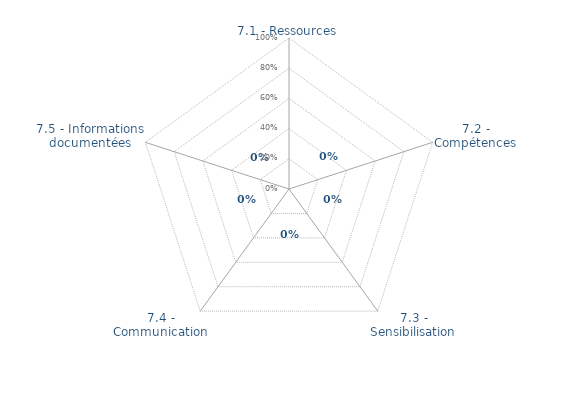
| Category | Art. 7 | limite de CONFORMITÉ |
|---|---|---|
| 7.1 - Ressources | 0 | 0 |
| 7.2 - Compétences | 0 | 0 |
| 7.3 - Sensibilisation | 0 | 0 |
| 7.4 - Communication | 0 | 0 |
| 7.5 - Informations documentées | 0 | 0 |